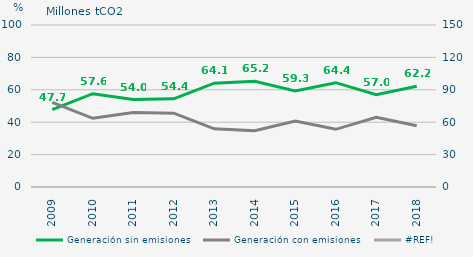
| Category | Generación sin emisiones | Generación con emisiones |
|---|---|---|
| 2009.0 | 47.7 | 52.3 |
| 2010.0 | 57.6 | 42.4 |
| 2011.0 | 54 | 46 |
| 2012.0 | 54.4 | 45.6 |
| 2013.0 | 64.1 | 35.9 |
| 2014.0 | 65.2 | 34.8 |
| 2015.0 | 59.3 | 40.7 |
| 2016.0 | 64.4 | 35.6 |
| 2017.0 | 57 | 43 |
| 2018.0 | 62.2 | 37.8 |